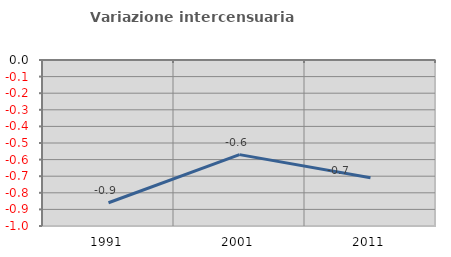
| Category | Variazione intercensuaria annua |
|---|---|
| 1991.0 | -0.86 |
| 2001.0 | -0.57 |
| 2011.0 | -0.71 |